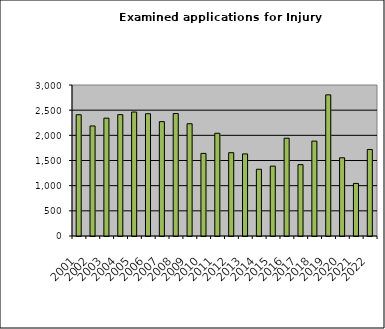
| Category | Series 0 |
|---|---|
| 2001.0 | 2409 |
| 2002.0 | 2186 |
| 2003.0 | 2341 |
| 2004.0 | 2411 |
| 2005.0 | 2463 |
| 2006.0 | 2429 |
| 2007.0 | 2272 |
| 2008.0 | 2433 |
| 2009.0 | 2230 |
| 2010.0 | 1641 |
| 2011.0 | 2041 |
| 2012.0 | 1655 |
| 2013.0 | 1631 |
| 2014.0 | 1326 |
| 2015.0 | 1388 |
| 2016.0 | 1943 |
| 2017.0 | 1418 |
| 2018.0 | 1885 |
| 2019.0 | 2804 |
| 2020.0 | 1554 |
| 2021.0 | 1044 |
| 2022.0 | 1719 |